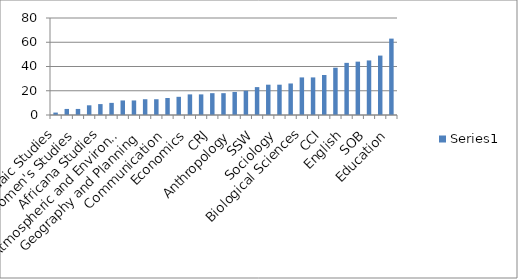
| Category | Series 0 |
|---|---|
| Judaic Studies | 2 |
| Theatre | 5 |
| Women's Studies | 5 |
| Music | 8 |
| Africana Studies | 9 |
| East Asian Studies | 10 |
| Atmospheric and Environmental Sciences | 12 |
| Philosophy | 12 |
| Geography and Planning | 13 |
| Physics | 13 |
| Communication | 14 |
| Art | 15 |
| Economics | 17 |
| Languages, Lteratures, & Cultures | 17 |
| CRJ | 18 |
| Chemistry | 18 |
| Anthropology | 19 |
| Latin American, Caribbean, and U.S Latino Studies | 20 |
| SSW | 23 |
| History | 25 |
| Sociology | 25 |
| Mathematics and Statistics | 26 |
| Biological Sciences | 31 |
| Psychology | 31 |
| CCI | 33 |
| SPH | 39 |
| English | 43 |
| Public Affairs | 44 |
| SOB | 45 |
| CNSE | 49 |
| Education | 63 |